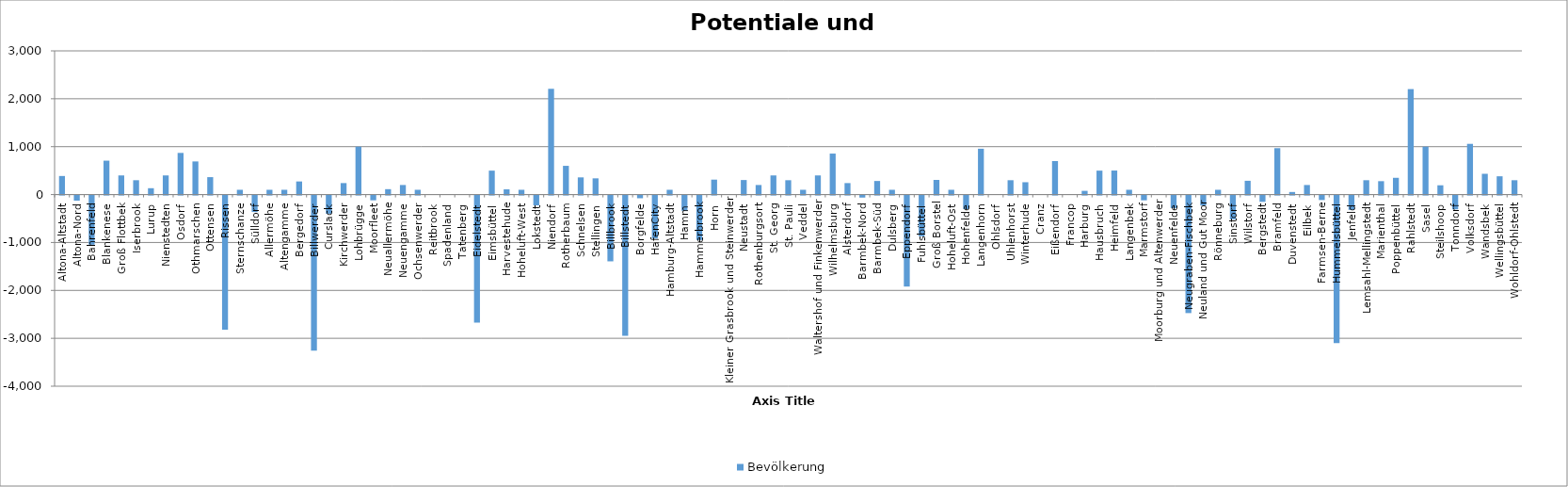
| Category | Bevölkerung |
|---|---|
| Altona-Altstadt | 388 |
| Altona-Nord | -107 |
| Bahrenfeld | -1027 |
| Blankenese | 708 |
| Groß Flottbek | 400 |
| Iserbrook | 300 |
| Lurup | 133 |
| Nienstedten | 400 |
| Osdorf | 870 |
| Othmarschen | 692 |
| Ottensen | 364 |
| Rissen | -2800 |
| Sternschanze | 100 |
| Sülldorf | -344 |
| Allermöhe | 100 |
| Altengamme | 100 |
| Bergedorf | 274 |
| Billwerder | -3240 |
| Curslack | -380 |
| Kirchwerder | 240 |
| Lohbrügge | 1000 |
| Moorfleet | -100 |
| Neuallermöhe | 113 |
| Neuengamme | 200 |
| Ochsenwerder | 100 |
| Reitbrook | 0 |
| Spadenland | 0 |
| Tatenberg | 0 |
| Eidelstedt | -2654 |
| Eimsbüttel | 500 |
| Harvestehude | 110 |
| Hoheluft-West | 100 |
| Lokstedt | -205 |
| Niendorf | 2208 |
| Rotherbaum | 600 |
| Schnelsen | 359 |
| Stellingen | 339 |
| Billbrook | -1374 |
| Billstedt | -2930 |
| Borgfelde | -57 |
| HafenCity | -900 |
| Hamburg-Altstadt | 100 |
| Hamm | -318 |
| Hammerbrook | -928 |
| Horn | 312 |
| Kleiner Grasbrook und Steinwerder | 0 |
| Neustadt | 304 |
| Rothenburgsort | 200 |
| St. Georg | 400 |
| St. Pauli | 300 |
| Veddel | 100 |
| Waltershof und Finkenwerder | 400 |
| Wilhelmsburg | 856 |
| Alsterdorf | 240 |
| Barmbek-Nord | -43 |
| Barmbek-Süd | 284 |
| Dulsberg | 100 |
| Eppendorf | -1900 |
| Fuhlsbüttel | -851 |
| Groß Borstel | 306 |
| Hoheluft-Ost | 100 |
| Hohenfelde | -284 |
| Langenhorn | 957 |
| Ohlsdorf | 0 |
| Uhlenhorst | 300 |
| Winterhude | 258 |
| Cranz | 0 |
| Eißendorf | 700 |
| Francop | 0 |
| Harburg | 78 |
| Hausbruch | 500 |
| Heimfeld | 502 |
| Langenbek | 100 |
| Marmstorf | -100 |
| Moorburg und Altenwerder | 0 |
| Neuenfelde | -262 |
| Neugraben-Fischbek | -2454 |
| Neuland und Gut Moor | -208 |
| Rönneburg | 100 |
| Sinstorf | -497 |
| Wilstorf | 288 |
| Bergstedt | -132 |
| Bramfeld | 969 |
| Duvenstedt | 54 |
| Eilbek | 200 |
| Farmsen-Berne | -94 |
| Hummelsbüttel | -3080 |
| Jenfeld | -300 |
| Lemsahl-Mellingstedt | 300 |
| Marienthal | 280 |
| Poppenbüttel | 350 |
| Rahlstedt | 2202 |
| Sasel | 1000 |
| Steilshoop | 194 |
| Tonndorf | -288 |
| Volksdorf | 1059 |
| Wandsbek | 434 |
| Wellingsbüttel | 382 |
| Wohldorf-Ohlstedt | 300 |